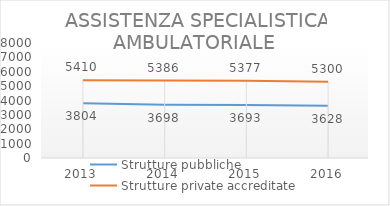
| Category | Strutture pubbliche | Strutture private accreditate |
|---|---|---|
| 2013.0 | 3804 | 5410 |
| 2014.0 | 3698 | 5386 |
| 2015.0 | 3693 | 5377 |
| 2016.0 | 3628 | 5300 |